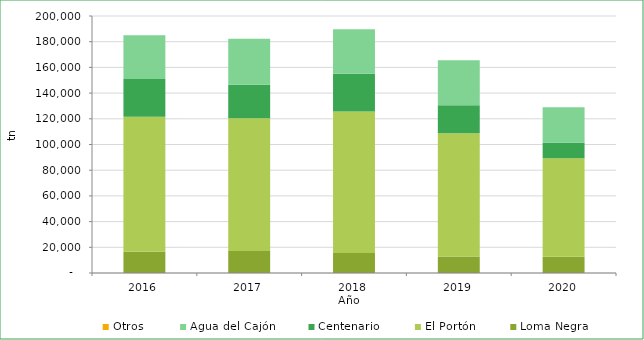
| Category | Loma Negra | El Portón | Centenario | Agua del Cajón | Otros |
|---|---|---|---|---|---|
| 2016.0 | 16450.33 | 105102.77 | 29500.67 | 33989.65 | 6.49 |
| 2017.0 | 17051.53 | 103364.92 | 26093.67 | 35692.33 | 0 |
| 2018.0 | 15485.24 | 110158.6 | 29384.67 | 34571.27 | 0 |
| 2019.0 | 12843.04 | 95956 | 21742.04 | 35024.29 | 0 |
| 2020.0 | 12725 | 76509 | 12068.13 | 27592.99 | 0 |